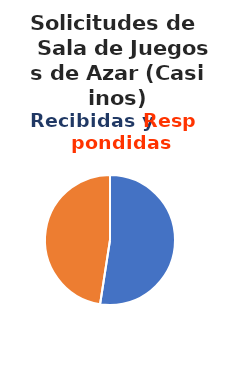
| Category | Series 0 |
|---|---|
| 0 | 43 |
| 1 | 39 |